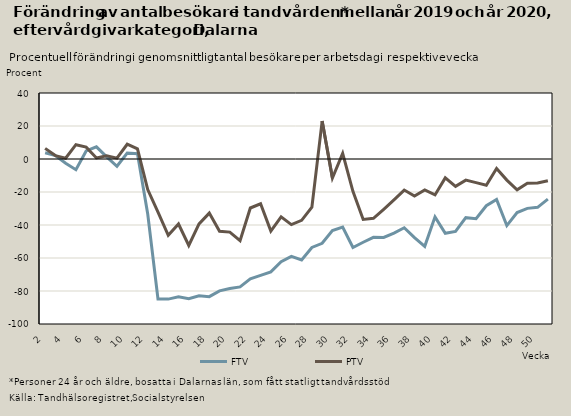
| Category | FTV | PTV |
|---|---|---|
| 2.0 | 3.75 | 6.429 |
| 3.0 | 2.068 | 2.065 |
| 4.0 | -2.604 | 0.452 |
| 5.0 | -6.473 | 8.686 |
| 6.0 | 4.889 | 7.2 |
| 7.0 | 7.376 | 0.635 |
| 8.0 | 1.25 | 1.95 |
| 9.0 | -4.397 | 0.522 |
| 10.0 | 3.622 | 8.948 |
| 11.0 | 3.229 | 6.132 |
| 12.0 | -33.37 | -18.554 |
| 13.0 | -84.842 | -32.234 |
| 14.0 | -84.922 | -46.269 |
| 15.0 | -83.515 | -39.403 |
| 16.0 | -84.65 | -52.402 |
| 17.0 | -82.91 | -39.313 |
| 18.0 | -83.406 | -32.792 |
| 19.0 | -79.896 | -43.836 |
| 20.0 | -78.467 | -44.315 |
| 21.0 | -77.503 | -49.5 |
| 22.0 | -72.683 | -29.695 |
| 23.0 | -70.574 | -27.163 |
| 24.0 | -68.439 | -43.683 |
| 25.0 | -62.246 | -35.042 |
| 26.0 | -58.98 | -39.752 |
| 27.0 | -61.159 | -37.154 |
| 28.0 | -53.621 | -29.235 |
| 29.0 | -51.093 | 22.965 |
| 30.0 | -43.415 | -11.538 |
| 31.0 | -41.308 | 3.44 |
| 32.0 | -53.66 | -19.606 |
| 33.0 | -50.466 | -36.615 |
| 34.0 | -47.457 | -35.957 |
| 35.0 | -47.524 | -30.459 |
| 36.0 | -44.907 | -24.715 |
| 37.0 | -41.681 | -18.818 |
| 38.0 | -47.653 | -22.454 |
| 39.0 | -52.935 | -18.786 |
| 40.0 | -35.077 | -21.771 |
| 41.0 | -45.003 | -11.438 |
| 42.0 | -43.849 | -16.589 |
| 43.0 | -35.548 | -12.819 |
| 44.0 | -36.147 | -14.303 |
| 45.0 | -28.324 | -15.867 |
| 46.0 | -24.48 | -5.804 |
| 47.0 | -40.361 | -12.797 |
| 48.0 | -32.414 | -18.677 |
| 49.0 | -29.927 | -14.695 |
| 50.0 | -29.296 | -14.576 |
| 51.0 | -24.349 | -13.141 |